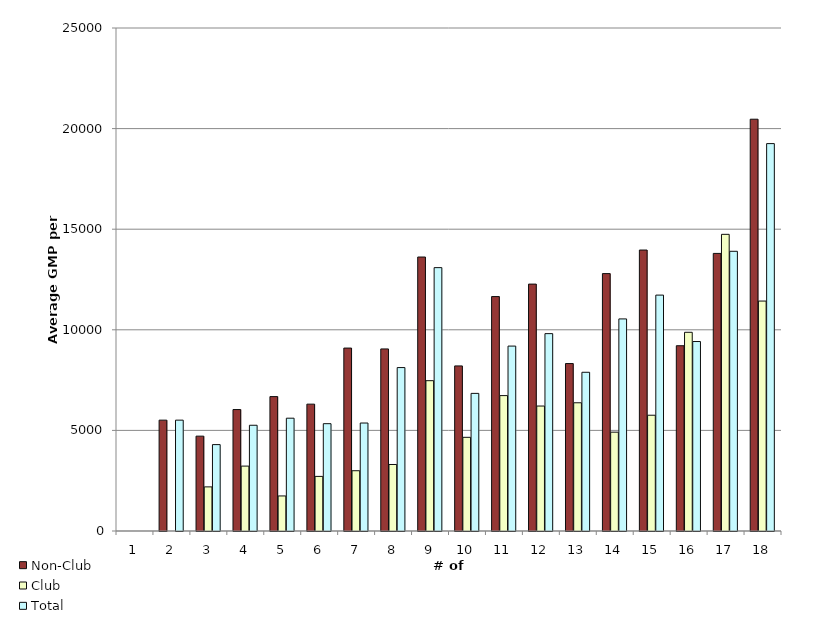
| Category | Non-Club | Club | Total |
|---|---|---|---|
| 0 | 0 | 0 | 0 |
| 1 | 5509.36 | 0 | 5509.36 |
| 2 | 4714.35 | 2193.064 | 4294.135 |
| 3 | 6035.851 | 3225.693 | 5255.252 |
| 4 | 6680.025 | 1742.5 | 5606.65 |
| 5 | 6304.512 | 2713.925 | 5334.083 |
| 6 | 9092.316 | 2995.537 | 5366.507 |
| 7 | 9049.383 | 3305.747 | 8122.99 |
| 8 | 13617.414 | 7471.251 | 13089.713 |
| 9 | 8204.914 | 4656.433 | 6840.114 |
| 10 | 11651.367 | 6729.888 | 9190.627 |
| 11 | 12271.529 | 6211.017 | 9809.446 |
| 12 | 8322.303 | 6372.93 | 7889.109 |
| 13 | 12792.987 | 4912.51 | 10541.422 |
| 14 | 13963.916 | 5754.073 | 11724.868 |
| 15 | 9208.43 | 9876.057 | 9417.064 |
| 16 | 13796.705 | 14744.755 | 13902.043 |
| 17 | 20466.903 | 11428.746 | 19254.062 |